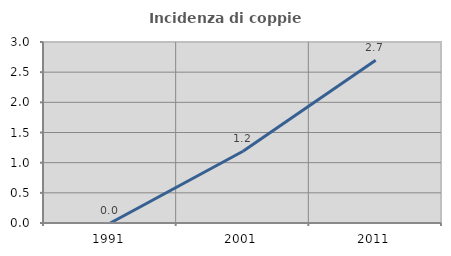
| Category | Incidenza di coppie miste |
|---|---|
| 1991.0 | 0 |
| 2001.0 | 1.188 |
| 2011.0 | 2.698 |